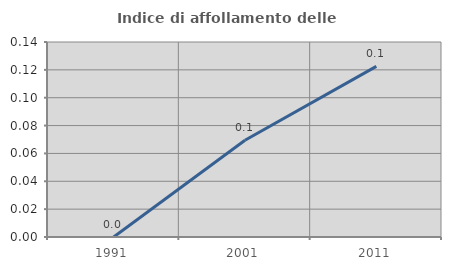
| Category | Indice di affollamento delle abitazioni  |
|---|---|
| 1991.0 | 0 |
| 2001.0 | 0.069 |
| 2011.0 | 0.122 |